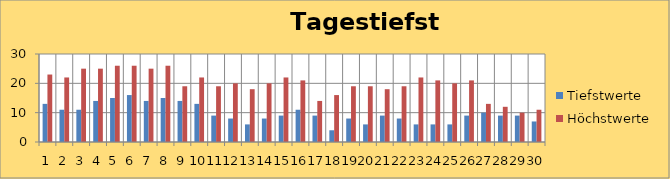
| Category | Tiefstwerte | Höchstwerte |
|---|---|---|
| 0 | 13 | 23 |
| 1 | 11 | 22 |
| 2 | 11 | 25 |
| 3 | 14 | 25 |
| 4 | 15 | 26 |
| 5 | 16 | 26 |
| 6 | 14 | 25 |
| 7 | 15 | 26 |
| 8 | 14 | 19 |
| 9 | 13 | 22 |
| 10 | 9 | 19 |
| 11 | 8 | 20 |
| 12 | 6 | 18 |
| 13 | 8 | 20 |
| 14 | 9 | 22 |
| 15 | 11 | 21 |
| 16 | 9 | 14 |
| 17 | 4 | 16 |
| 18 | 8 | 19 |
| 19 | 6 | 19 |
| 20 | 9 | 18 |
| 21 | 8 | 19 |
| 22 | 6 | 22 |
| 23 | 6 | 21 |
| 24 | 6 | 20 |
| 25 | 9 | 21 |
| 26 | 10 | 13 |
| 27 | 9 | 12 |
| 28 | 9 | 10 |
| 29 | 7 | 11 |